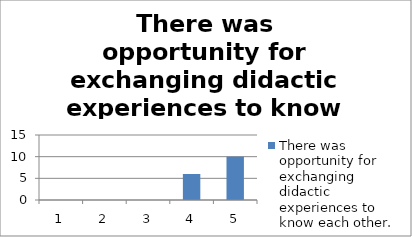
| Category | There was opportunity for exchanging didactic experiences to know each other. |
|---|---|
| 0 | 0 |
| 1 | 0 |
| 2 | 0 |
| 3 | 6 |
| 4 | 10 |